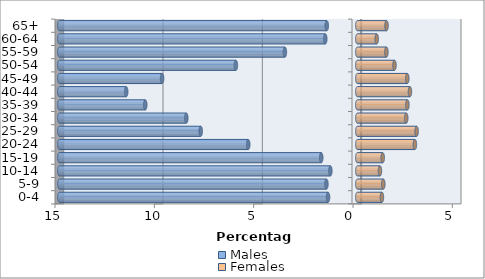
| Category | Males | Females |
|---|---|---|
| 0-4 | -1.475 | 1.237 |
| 5-9 | -1.556 | 1.306 |
| 10-14 | -1.358 | 1.138 |
| 15-19 | -1.817 | 1.277 |
| 20-24 | -5.492 | 2.897 |
| 25-29 | -7.884 | 2.984 |
| 30-34 | -8.61 | 2.462 |
| 35-39 | -10.676 | 2.52 |
| 40-44 | -11.634 | 2.647 |
| 45-49 | -9.829 | 2.514 |
| 50-54 | -6.113 | 1.869 |
| 55-59 | -3.646 | 1.463 |
| 60-64 | -1.614 | 0.975 |
| 65+ | -1.538 | 1.469 |